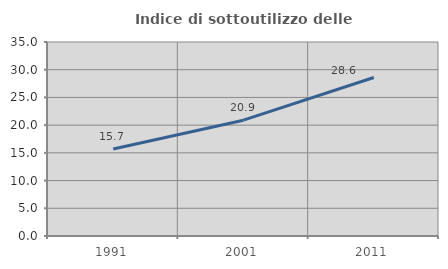
| Category | Indice di sottoutilizzo delle abitazioni  |
|---|---|
| 1991.0 | 15.695 |
| 2001.0 | 20.895 |
| 2011.0 | 28.592 |